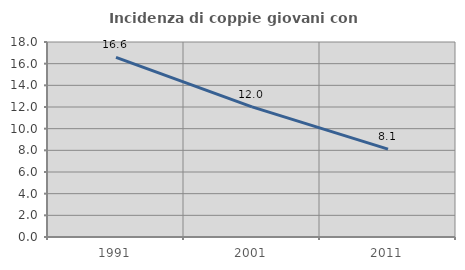
| Category | Incidenza di coppie giovani con figli |
|---|---|
| 1991.0 | 16.578 |
| 2001.0 | 12.009 |
| 2011.0 | 8.117 |